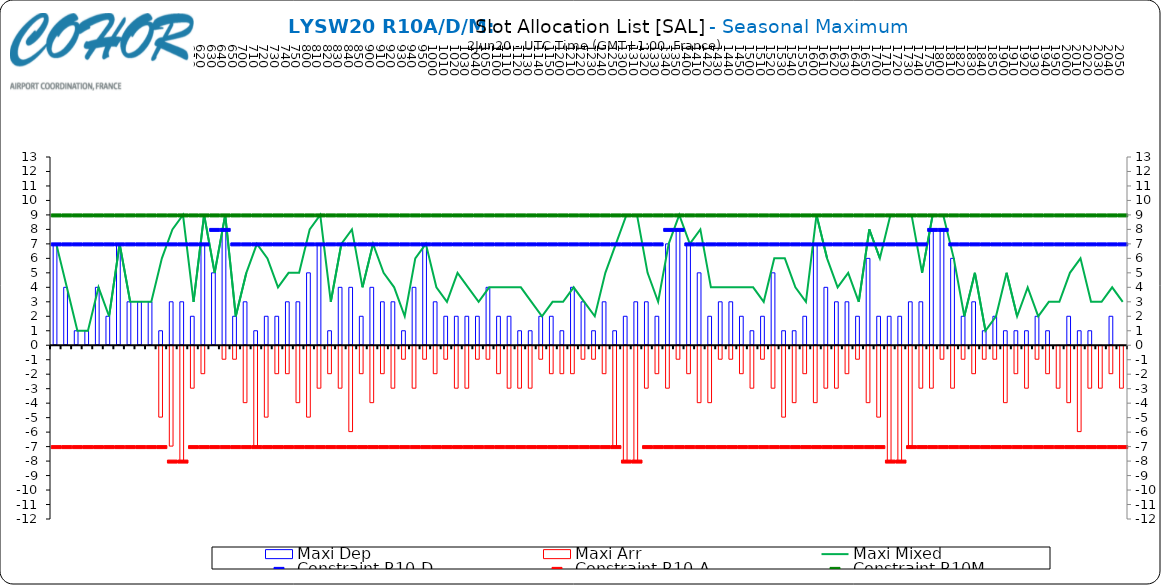
| Category | Maxi Dep | Maxi Arr |
|---|---|---|
| 400 | 7 | 0 |
| 410 | 4 | 0 |
| 420 | 1 | 0 |
| 430 | 1 | 0 |
| 440 | 4 | 0 |
| 450 | 2 | 0 |
| 500 | 7 | 0 |
| 510 | 3 | 0 |
| 520 | 3 | 0 |
| 530 | 3 | 0 |
| 540 | 1 | -5 |
| 550 | 3 | -7 |
| 600 | 3 | -8 |
| 610 | 2 | -3 |
| 620 | 7 | -2 |
| 630 | 5 | 0 |
| 640 | 8 | -1 |
| 650 | 2 | -1 |
| 700 | 3 | -4 |
| 710 | 1 | -7 |
| 720 | 2 | -5 |
| 730 | 2 | -2 |
| 740 | 3 | -2 |
| 750 | 3 | -4 |
| 800 | 5 | -5 |
| 810 | 7 | -3 |
| 820 | 1 | -2 |
| 830 | 4 | -3 |
| 840 | 4 | -6 |
| 850 | 2 | -2 |
| 900 | 4 | -4 |
| 910 | 3 | -2 |
| 920 | 3 | -3 |
| 930 | 1 | -1 |
| 940 | 4 | -3 |
| 950 | 7 | -1 |
| 1000 | 3 | -2 |
| 1010 | 2 | -1 |
| 1020 | 2 | -3 |
| 1030 | 2 | -3 |
| 1040 | 2 | -1 |
| 1050 | 4 | -1 |
| 1100 | 2 | -2 |
| 1110 | 2 | -3 |
| 1120 | 1 | -3 |
| 1130 | 1 | -3 |
| 1140 | 2 | -1 |
| 1150 | 2 | -2 |
| 1200 | 1 | -2 |
| 1210 | 4 | -2 |
| 1220 | 3 | -1 |
| 1230 | 1 | -1 |
| 1240 | 3 | -2 |
| 1250 | 1 | -7 |
| 1300 | 2 | -8 |
| 1310 | 3 | -8 |
| 1320 | 3 | -3 |
| 1330 | 2 | -2 |
| 1340 | 7 | -3 |
| 1350 | 8 | -1 |
| 1400 | 7 | -2 |
| 1410 | 5 | -4 |
| 1420 | 2 | -4 |
| 1430 | 3 | -1 |
| 1440 | 3 | -1 |
| 1450 | 2 | -2 |
| 1500 | 1 | -3 |
| 1510 | 2 | -1 |
| 1520 | 5 | -3 |
| 1530 | 1 | -5 |
| 1540 | 1 | -4 |
| 1550 | 2 | -2 |
| 1600 | 7 | -4 |
| 1610 | 4 | -3 |
| 1620 | 3 | -3 |
| 1630 | 3 | -2 |
| 1640 | 2 | -1 |
| 1650 | 6 | -4 |
| 1700 | 2 | -5 |
| 1710 | 2 | -8 |
| 1720 | 2 | -8 |
| 1730 | 3 | -7 |
| 1740 | 3 | -3 |
| 1750 | 8 | -3 |
| 1800 | 8 | -1 |
| 1810 | 6 | -3 |
| 1820 | 2 | -1 |
| 1830 | 3 | -2 |
| 1840 | 1 | -1 |
| 1850 | 2 | -1 |
| 1900 | 1 | -4 |
| 1910 | 1 | -2 |
| 1920 | 1 | -3 |
| 1930 | 2 | -1 |
| 1940 | 1 | -2 |
| 1950 | 0 | -3 |
| 2000 | 2 | -4 |
| 2010 | 1 | -6 |
| 2020 | 1 | -3 |
| 2030 | 0 | -3 |
| 2040 | 2 | -2 |
| 2050 | 0 | -3 |